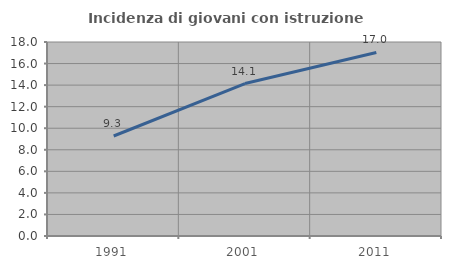
| Category | Incidenza di giovani con istruzione universitaria |
|---|---|
| 1991.0 | 9.278 |
| 2001.0 | 14.146 |
| 2011.0 | 17.033 |